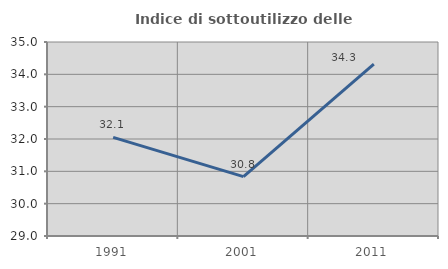
| Category | Indice di sottoutilizzo delle abitazioni  |
|---|---|
| 1991.0 | 32.051 |
| 2001.0 | 30.836 |
| 2011.0 | 34.314 |